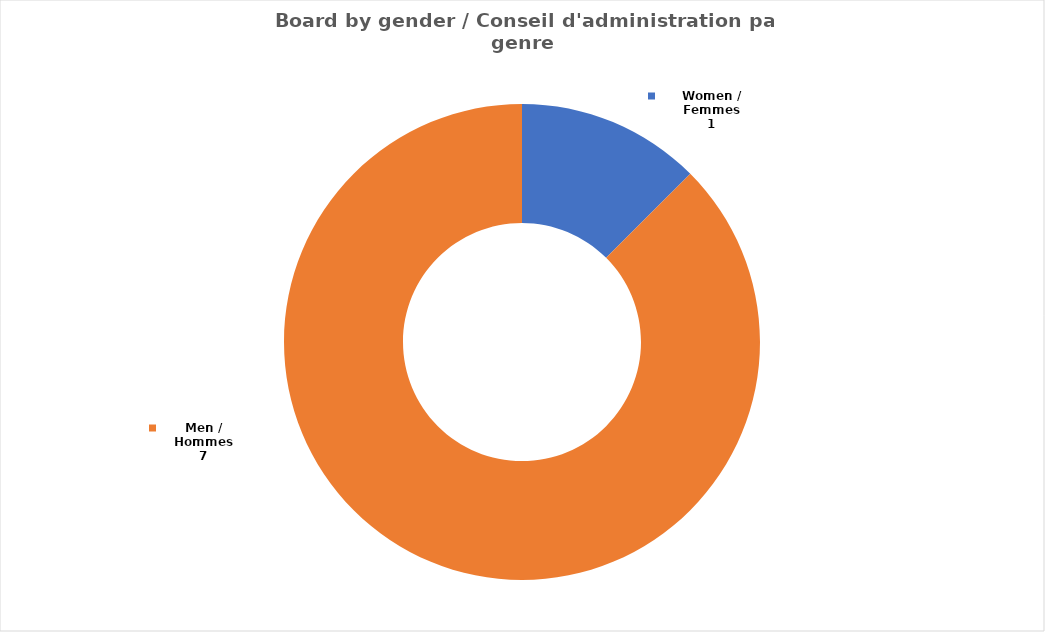
| Category | Series 0 |
|---|---|
| Women / Femmes | 1 |
| Men / Hommes | 7 |